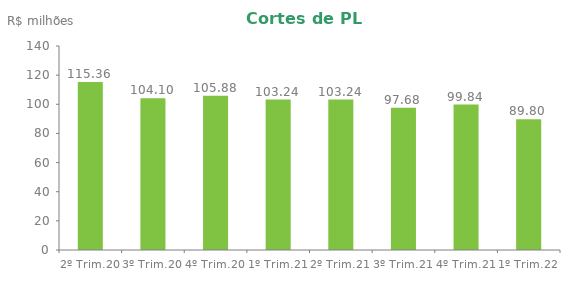
| Category | Series 0 |
|---|---|
| 2º Trim.20 | 115.362 |
| 3º Trim.20 | 104.099 |
| 4º Trim.20 | 105.884 |
| 1º Trim.21 | 103.241 |
| 2º Trim.21 | 103.241 |
| 3º Trim.21 | 97.678 |
| 4º Trim.21 | 99.84 |
| 1º Trim.22 | 89.798 |